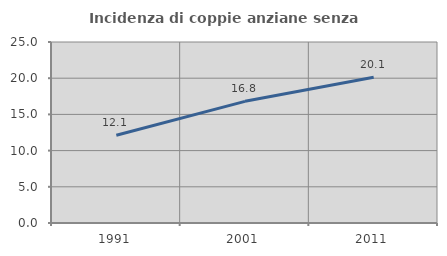
| Category | Incidenza di coppie anziane senza figli  |
|---|---|
| 1991.0 | 12.116 |
| 2001.0 | 16.805 |
| 2011.0 | 20.13 |